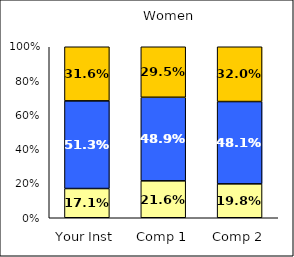
| Category | Low Sense of Belonging | Average Sense of Belonging | High Sense of Belonging |
|---|---|---|---|
| Your Inst | 0.171 | 0.513 | 0.316 |
| Comp 1 | 0.216 | 0.489 | 0.295 |
| Comp 2 | 0.198 | 0.481 | 0.32 |